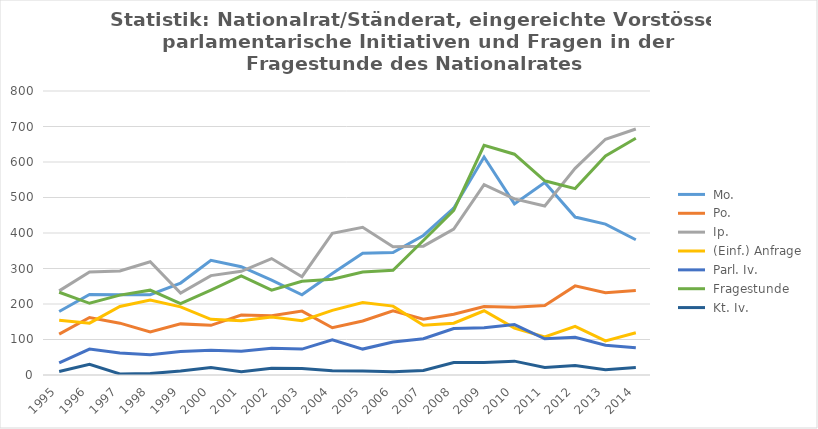
| Category |  Mo. |  Po. |  Ip. |  (Einf.) Anfrage |  Parl. Iv. |  Fragestunde |  Kt. Iv. |
|---|---|---|---|---|---|---|---|
| 1995 | 179 | 115 | 237 | 154 | 34 | 233 | 10 |
| 1996 | 227 | 162 | 290 | 146 | 73 | 202 | 30 |
| 1997 | 226 | 146 | 293 | 193 | 62 | 225 | 3 |
| 1998 | 226 | 121 | 319 | 211 | 57 | 239 | 4 |
| 1999 | 259 | 144 | 231 | 192 | 66 | 201 | 11 |
| 2000 | 323 | 140 | 280 | 157 | 70 | 239 | 21 |
| 2001 | 305 | 169 | 292 | 153 | 67 | 279 | 9 |
| 2002 | 267 | 167 | 328 | 163 | 75 | 239 | 19 |
| 2003 | 226 | 180 | 277 | 153 | 73 | 264 | 18 |
| 2004 | 286 | 133 | 399 | 182 | 99 | 270 | 12 |
| 2005 | 343 | 152 | 416 | 204 | 73 | 290 | 11 |
| 2006 | 345 | 181 | 361 | 194 | 93 | 295 | 9 |
| 2007 | 393 | 157 | 363 | 140 | 102 | 379 | 13 |
| 2008 | 470 | 171 | 411 | 146 | 131 | 464 | 35 |
| 2009 | 614 | 193 | 536 | 181 | 133 | 647 | 35 |
| 2010 | 482 | 191 | 496 | 132 | 142 | 622 | 39 |
| 2011 | 542 | 196 | 476 | 107 | 102 | 547 | 21 |
| 2012 | 445 | 251 | 582 | 137 | 106 | 525 | 27 |
| 2013 | 425 | 232 | 664 | 96 | 84 | 617 | 15 |
| 2014 | 381 | 238 | 693 | 119 | 77 | 667 | 21 |